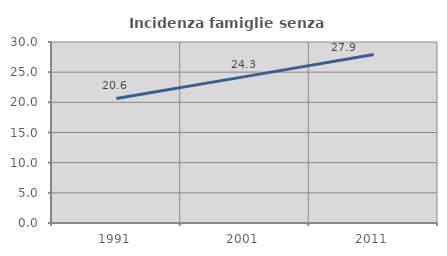
| Category | Incidenza famiglie senza nuclei |
|---|---|
| 1991.0 | 20.648 |
| 2001.0 | 24.259 |
| 2011.0 | 27.927 |